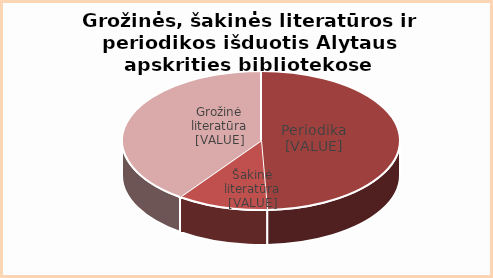
| Category | Series 0 |
|---|---|
| Periodika | 0.493 |
| Šakinė | 0.106 |
| Grožinė | 0.401 |